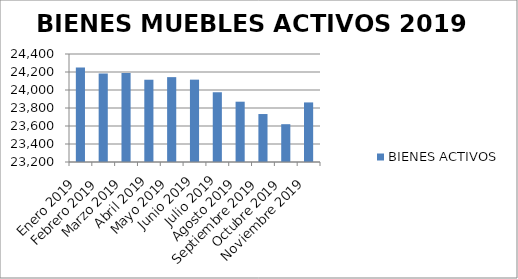
| Category | BIENES ACTIVOS |
|---|---|
| Enero 2019 | 24249 |
| Febrero 2019 | 24183 |
| Marzo 2019 | 24188 |
| Abril 2019 | 24114 |
| Mayo 2019 | 24143 |
| Junio 2019 | 24115 |
| Julio 2019 | 23975 |
| Agosto 2019 | 23870 |
| Septiembre 2019 | 23733 |
| Octubre 2019 | 23620 |
| Noviembre 2019 | 23862 |